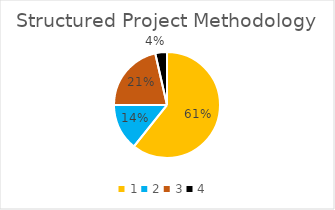
| Category | Series 0 |
|---|---|
| 0 | 0.607 |
| 1 | 0.143 |
| 2 | 0.214 |
| 3 | 0.036 |